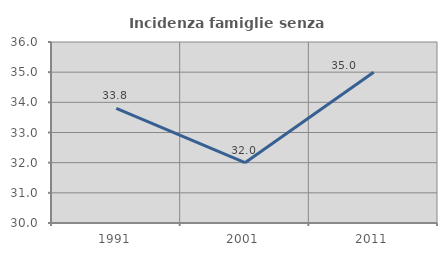
| Category | Incidenza famiglie senza nuclei |
|---|---|
| 1991.0 | 33.803 |
| 2001.0 | 32 |
| 2011.0 | 35 |